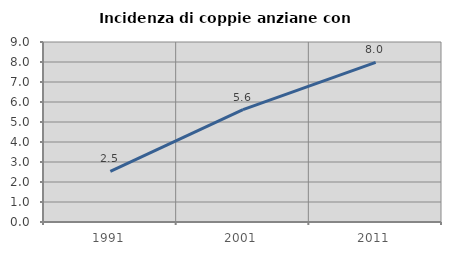
| Category | Incidenza di coppie anziane con figli |
|---|---|
| 1991.0 | 2.532 |
| 2001.0 | 5.618 |
| 2011.0 | 7.985 |